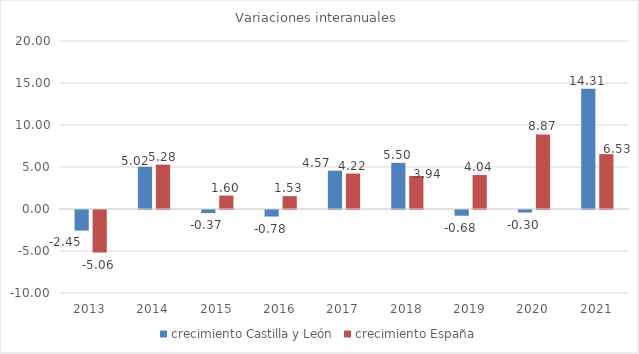
| Category | crecimiento Castilla y León | crecimiento España |
|---|---|---|
| 2013.0 | -2.453 | -5.061 |
| 2014.0 | 5.022 | 5.284 |
| 2015.0 | -0.371 | 1.597 |
| 2016.0 | -0.777 | 1.528 |
| 2017.0 | 4.566 | 4.224 |
| 2018.0 | 5.499 | 3.935 |
| 2019.0 | -0.684 | 4.044 |
| 2020.0 | -0.3 | 8.87 |
| 2021.0 | 14.311 | 6.531 |